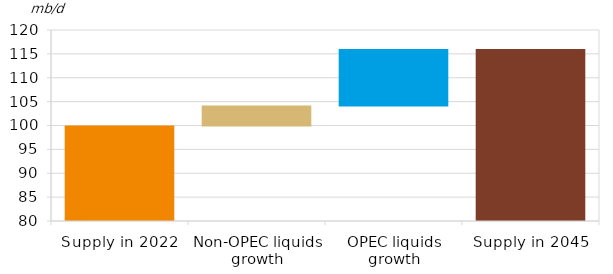
| Category | Series 0 | Series 1 |
|---|---|---|
| Supply in 2022 | 100.01 | 100.01 |
| Non-OPEC liquids growth | 100.01 | 4.177 |
| OPEC liquids growth | 104.187 | 11.856 |
| Supply in 2045 | 0 | 116.043 |